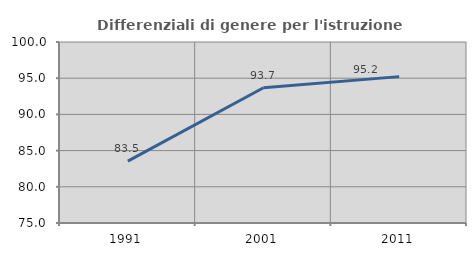
| Category | Differenziali di genere per l'istruzione superiore |
|---|---|
| 1991.0 | 83.54 |
| 2001.0 | 93.684 |
| 2011.0 | 95.218 |